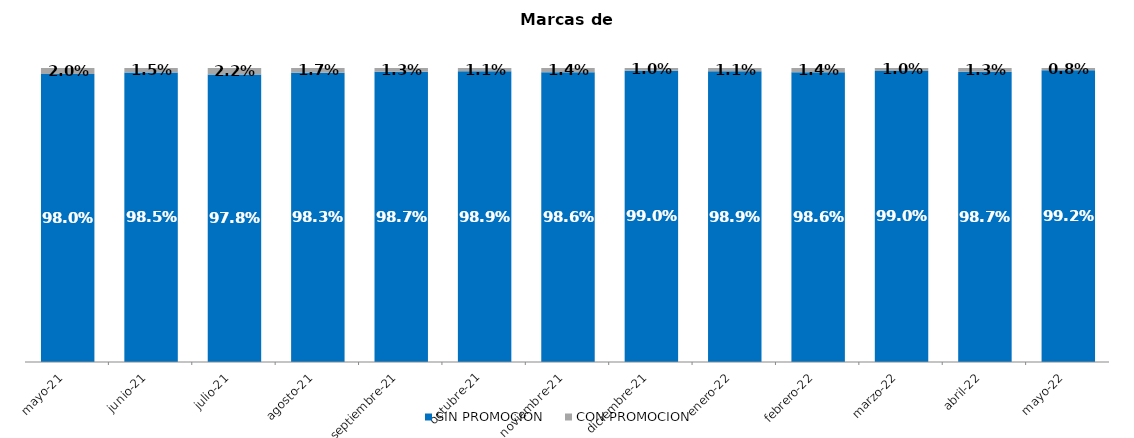
| Category | SIN PROMOCION   | CON PROMOCION   |
|---|---|---|
| 2021-05-01 | 0.98 | 0.02 |
| 2021-06-01 | 0.985 | 0.015 |
| 2021-07-01 | 0.978 | 0.022 |
| 2021-08-01 | 0.983 | 0.017 |
| 2021-09-01 | 0.987 | 0.013 |
| 2021-10-01 | 0.989 | 0.011 |
| 2021-11-01 | 0.986 | 0.014 |
| 2021-12-01 | 0.99 | 0.01 |
| 2022-01-01 | 0.989 | 0.011 |
| 2022-02-01 | 0.986 | 0.014 |
| 2022-03-01 | 0.99 | 0.01 |
| 2022-04-01 | 0.987 | 0.013 |
| 2022-05-01 | 0.992 | 0.008 |